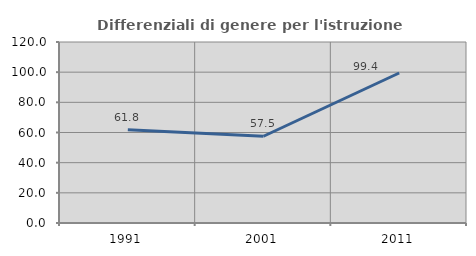
| Category | Differenziali di genere per l'istruzione superiore |
|---|---|
| 1991.0 | 61.8 |
| 2001.0 | 57.516 |
| 2011.0 | 99.445 |